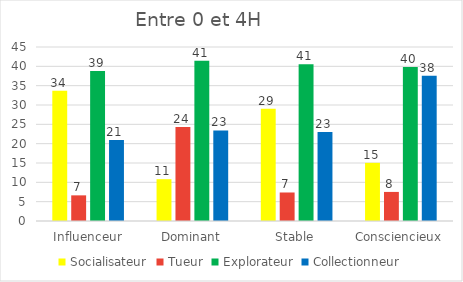
| Category | Socialisateur | Tueur | Explorateur | Collectionneur |
|---|---|---|---|---|
| Influenceur | 33.673 | 6.633 | 38.776 | 20.918 |
| Dominant | 10.811 | 24.324 | 41.441 | 23.423 |
| Stable | 29.032 | 7.373 | 40.553 | 23.041 |
| Consciencieux | 15.038 | 7.519 | 39.85 | 37.594 |